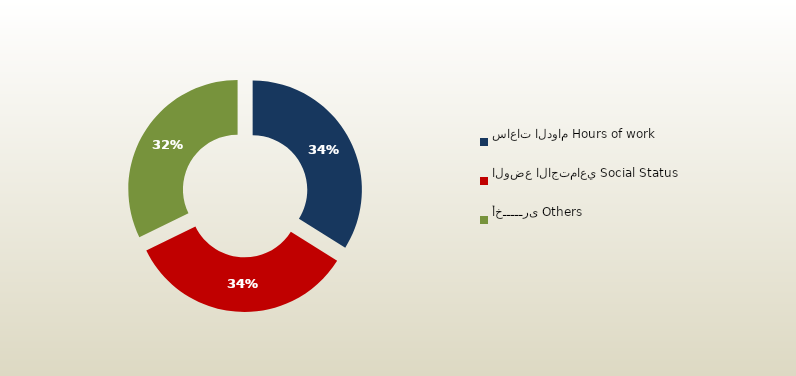
| Category | المجموع
Total |
|---|---|
| ساعات الدوام Hours of work | 60 |
| الوضع الاجتماعي Social Status | 60 |
| أخـــــرى Others | 57 |